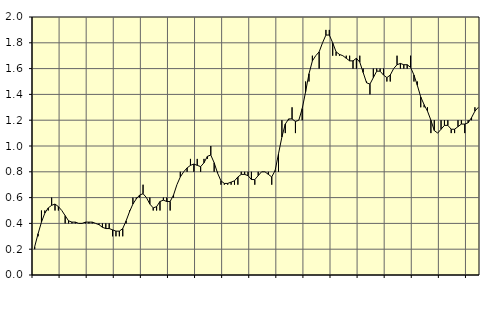
| Category | Piggar | Anställda utomlands |
|---|---|---|
| nan | 0.2 | 0.22 |
| 87.0 | 0.3 | 0.32 |
| 87.0 | 0.5 | 0.41 |
| 87.0 | 0.5 | 0.48 |
| nan | 0.5 | 0.52 |
| 88.0 | 0.6 | 0.54 |
| 88.0 | 0.5 | 0.55 |
| 88.0 | 0.5 | 0.53 |
| nan | 0.5 | 0.5 |
| 89.0 | 0.4 | 0.46 |
| 89.0 | 0.4 | 0.42 |
| 89.0 | 0.4 | 0.41 |
| nan | 0.4 | 0.41 |
| 90.0 | 0.4 | 0.4 |
| 90.0 | 0.4 | 0.4 |
| 90.0 | 0.4 | 0.41 |
| nan | 0.4 | 0.41 |
| 91.0 | 0.4 | 0.41 |
| 91.0 | 0.4 | 0.4 |
| 91.0 | 0.4 | 0.39 |
| nan | 0.4 | 0.37 |
| 92.0 | 0.4 | 0.36 |
| 92.0 | 0.4 | 0.36 |
| 92.0 | 0.3 | 0.35 |
| nan | 0.3 | 0.34 |
| 93.0 | 0.3 | 0.34 |
| 93.0 | 0.3 | 0.36 |
| 93.0 | 0.4 | 0.42 |
| nan | 0.5 | 0.49 |
| 94.0 | 0.6 | 0.55 |
| 94.0 | 0.6 | 0.59 |
| 94.0 | 0.6 | 0.62 |
| nan | 0.7 | 0.63 |
| 95.0 | 0.6 | 0.6 |
| 95.0 | 0.6 | 0.55 |
| 95.0 | 0.5 | 0.52 |
| nan | 0.5 | 0.53 |
| 96.0 | 0.5 | 0.57 |
| 96.0 | 0.6 | 0.58 |
| 96.0 | 0.6 | 0.57 |
| nan | 0.5 | 0.57 |
| 97.0 | 0.6 | 0.62 |
| 97.0 | 0.7 | 0.7 |
| 97.0 | 0.8 | 0.76 |
| nan | 0.8 | 0.8 |
| 98.0 | 0.8 | 0.83 |
| 98.0 | 0.9 | 0.85 |
| 98.0 | 0.8 | 0.86 |
| nan | 0.9 | 0.85 |
| 99.0 | 0.8 | 0.84 |
| 99.0 | 0.9 | 0.87 |
| 99.0 | 0.9 | 0.92 |
| nan | 1 | 0.93 |
| 0.0 | 0.8 | 0.87 |
| 0.0 | 0.8 | 0.79 |
| 0.0 | 0.7 | 0.73 |
| nan | 0.7 | 0.71 |
| 1.0 | 0.7 | 0.71 |
| 1.0 | 0.7 | 0.72 |
| 1.0 | 0.7 | 0.73 |
| nan | 0.7 | 0.76 |
| 2.0 | 0.8 | 0.78 |
| 2.0 | 0.8 | 0.78 |
| 2.0 | 0.8 | 0.77 |
| nan | 0.8 | 0.74 |
| 3.0 | 0.7 | 0.74 |
| 3.0 | 0.8 | 0.77 |
| 3.0 | 0.8 | 0.8 |
| nan | 0.8 | 0.8 |
| 4.0 | 0.8 | 0.78 |
| 4.0 | 0.7 | 0.76 |
| 4.0 | 0.8 | 0.81 |
| nan | 0.8 | 0.94 |
| 5.0 | 1.2 | 1.07 |
| 5.0 | 1.1 | 1.17 |
| 5.0 | 1.2 | 1.21 |
| nan | 1.3 | 1.21 |
| 6.0 | 1.1 | 1.19 |
| 6.0 | 1.2 | 1.2 |
| 6.0 | 1.2 | 1.29 |
| nan | 1.5 | 1.42 |
| 7.0 | 1.5 | 1.56 |
| 7.0 | 1.7 | 1.66 |
| 7.0 | 1.7 | 1.7 |
| nan | 1.6 | 1.73 |
| 8.0 | 1.8 | 1.8 |
| 8.0 | 1.9 | 1.86 |
| 8.0 | 1.9 | 1.86 |
| nan | 1.7 | 1.8 |
| 9.0 | 1.7 | 1.73 |
| 9.0 | 1.7 | 1.71 |
| 9.0 | 1.7 | 1.7 |
| nan | 1.7 | 1.68 |
| 10.0 | 1.7 | 1.66 |
| 10.0 | 1.6 | 1.66 |
| 10.0 | 1.6 | 1.68 |
| nan | 1.7 | 1.65 |
| 11.0 | 1.6 | 1.57 |
| 11.0 | 1.5 | 1.49 |
| 11.0 | 1.4 | 1.48 |
| nan | 1.6 | 1.53 |
| 12.0 | 1.6 | 1.58 |
| 12.0 | 1.6 | 1.58 |
| 12.0 | 1.6 | 1.55 |
| nan | 1.5 | 1.53 |
| 13.0 | 1.5 | 1.55 |
| 13.0 | 1.6 | 1.6 |
| 13.0 | 1.7 | 1.63 |
| nan | 1.6 | 1.64 |
| 14.0 | 1.6 | 1.63 |
| 14.0 | 1.6 | 1.63 |
| 14.0 | 1.7 | 1.61 |
| nan | 1.5 | 1.55 |
| 15.0 | 1.5 | 1.47 |
| 15.0 | 1.3 | 1.38 |
| 15.0 | 1.3 | 1.32 |
| nan | 1.3 | 1.27 |
| 16.0 | 1.1 | 1.2 |
| 16.0 | 1.2 | 1.12 |
| 16.0 | 1.1 | 1.1 |
| nan | 1.2 | 1.13 |
| 17.0 | 1.2 | 1.16 |
| 17.0 | 1.2 | 1.16 |
| 17.0 | 1.1 | 1.13 |
| nan | 1.1 | 1.13 |
| 18.0 | 1.2 | 1.15 |
| 18.0 | 1.2 | 1.17 |
| 18.0 | 1.1 | 1.17 |
| nan | 1.2 | 1.18 |
| 19.0 | 1.2 | 1.22 |
| 19.0 | 1.3 | 1.27 |
| 19.0 | 1.3 | 1.3 |